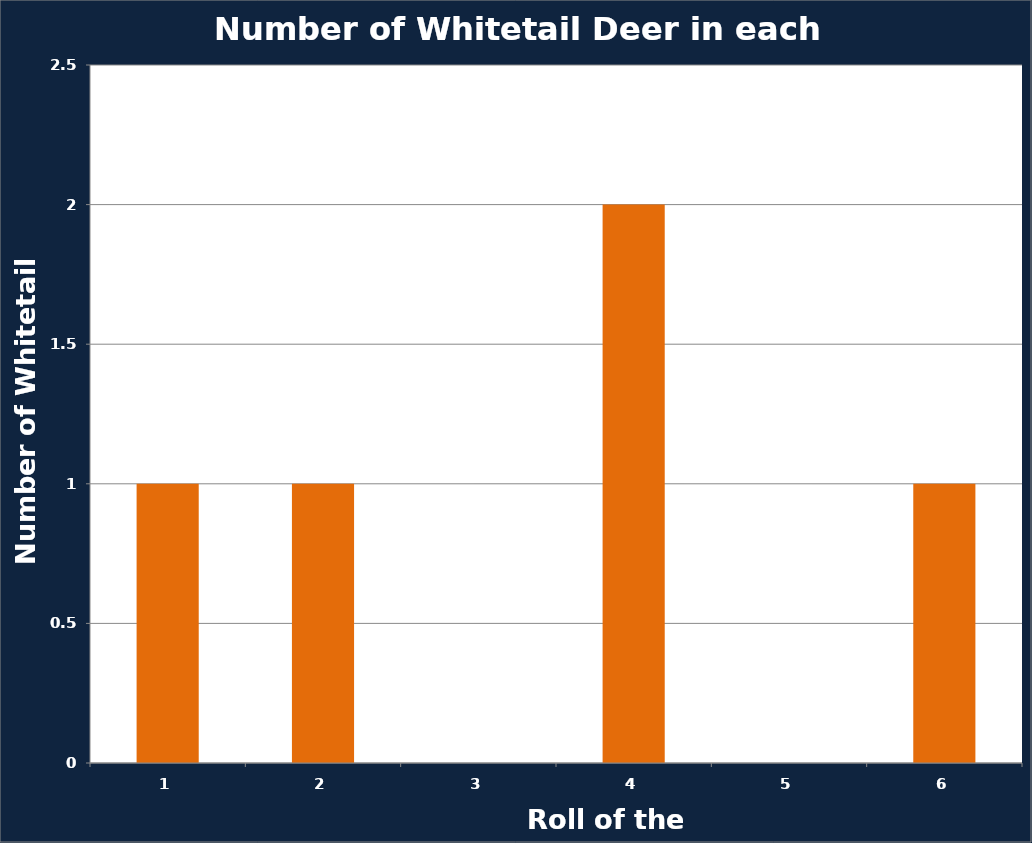
| Category | Series 1 |
|---|---|
| 0 | 1 |
| 1 | 1 |
| 2 | 0 |
| 3 | 2 |
| 4 | 0 |
| 5 | 1 |